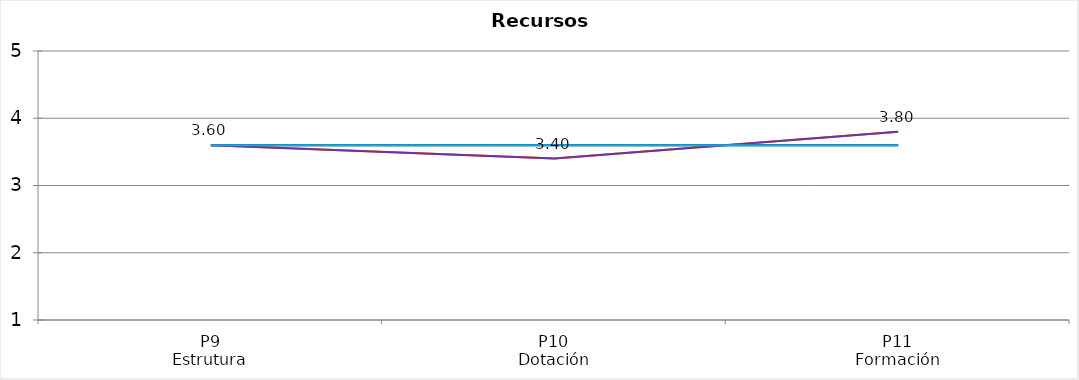
| Category | Valoración (1-5) | MEDIA |
|---|---|---|
| P9
Estrutura | 3.6 | 3.6 |
| P10
Dotación | 3.4 | 3.6 |
| P11
Formación | 3.8 | 3.6 |